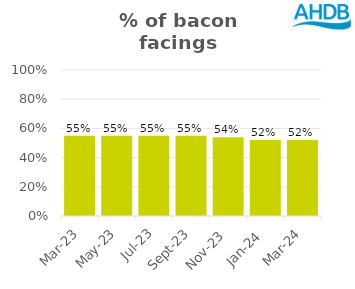
| Category | Bacon |
|---|---|
| 2023-03-01 | 0.55 |
| 2023-05-01 | 0.55 |
| 2023-07-01 | 0.55 |
| 2023-09-01 | 0.55 |
| 2023-11-01 | 0.54 |
| 2024-01-01 | 0.52 |
| 2024-03-01 | 0.52 |